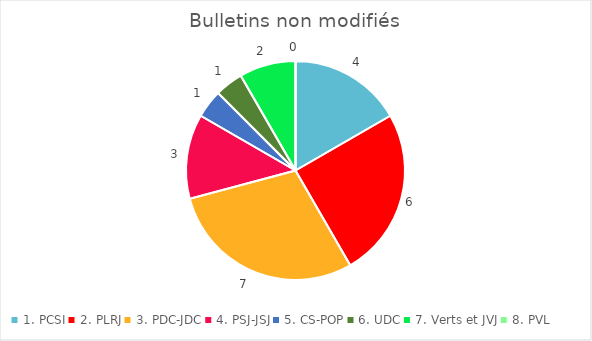
| Category | Series 0 |
|---|---|
| 1. PCSI | 4 |
| 2. PLRJ | 6 |
| 3. PDC-JDC | 7 |
| 4. PSJ-JSJ | 3 |
| 5. CS-POP | 1 |
| 6. UDC | 1 |
| 7. Verts et JVJ | 2 |
| 8. PVL | 0 |